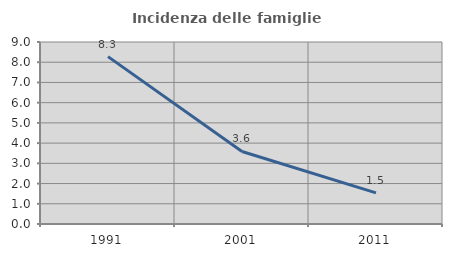
| Category | Incidenza delle famiglie numerose |
|---|---|
| 1991.0 | 8.276 |
| 2001.0 | 3.588 |
| 2011.0 | 1.54 |